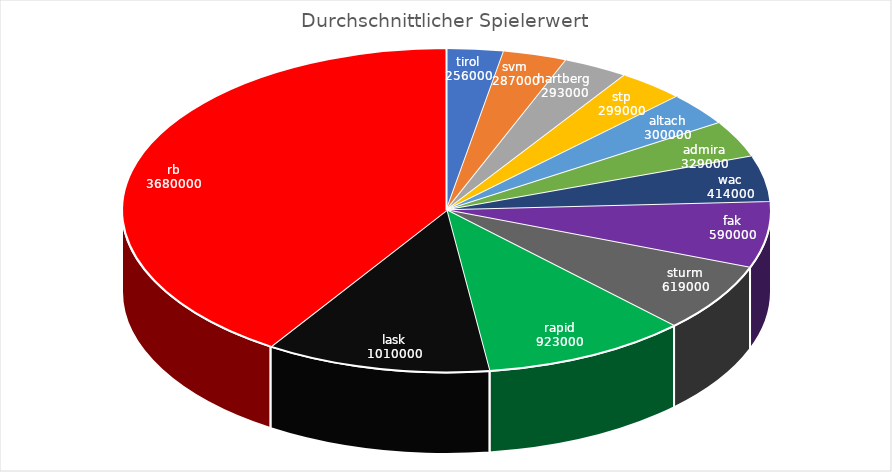
| Category | Series 0 |
|---|---|
| tirol | 256000 |
| svm | 287000 |
| hartberg | 293000 |
| stp | 299000 |
| altach | 300000 |
| admira | 329000 |
| wac | 414000 |
| fak | 590000 |
| sturm | 619000 |
| rapid | 923000 |
| lask | 1010000 |
| rb | 3680000 |